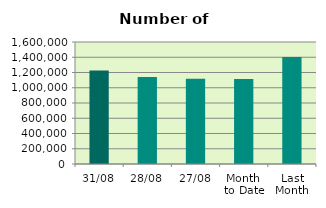
| Category | Series 0 |
|---|---|
| 31/08 | 1225930 |
| 28/08 | 1139672 |
| 27/08 | 1116628 |
| Month 
to Date | 1113186.286 |
| Last
Month | 1404253.739 |